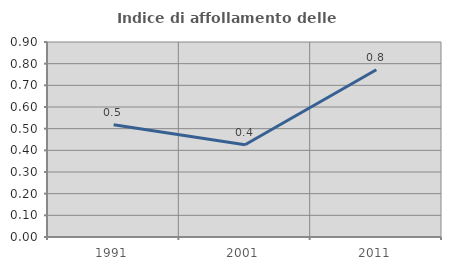
| Category | Indice di affollamento delle abitazioni  |
|---|---|
| 1991.0 | 0.518 |
| 2001.0 | 0.426 |
| 2011.0 | 0.772 |